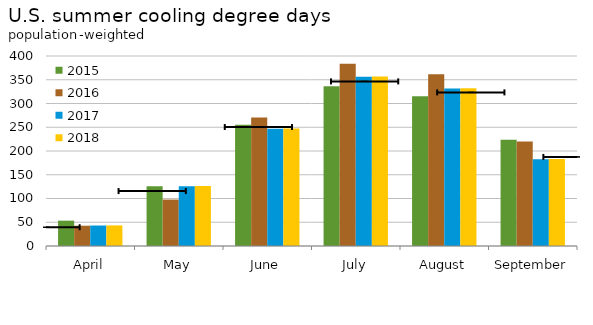
| Category | 2015 | 2016 | 2017 | 2018 |
|---|---|---|---|---|
| April | 53.354 | 42.69 | 43.096 | 43.331 |
| May | 125.986 | 97.755 | 125.897 | 126.311 |
| June | 255.115 | 270.736 | 246.707 | 247.17 |
| July | 336.067 | 383.631 | 356.21 | 356.647 |
| August | 315.338 | 361.429 | 331.592 | 332.067 |
| September | 223.646 | 220.218 | 182.864 | 183.375 |